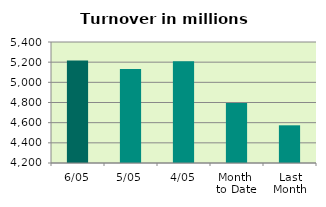
| Category | Series 0 |
|---|---|
| 6/05 | 5216.259 |
| 5/05 | 5133.373 |
| 4/05 | 5208.178 |
| Month 
to Date | 4795.723 |
| Last
Month | 4573.802 |